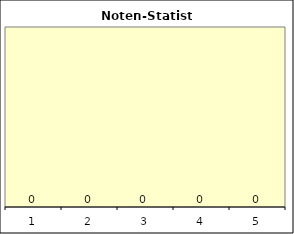
| Category | Series 0 | Series 1 |
|---|---|---|
| 0 |  | 0 |
| 1 |  | 0 |
| 2 |  | 0 |
| 3 |  | 0 |
| 4 |  | 0 |